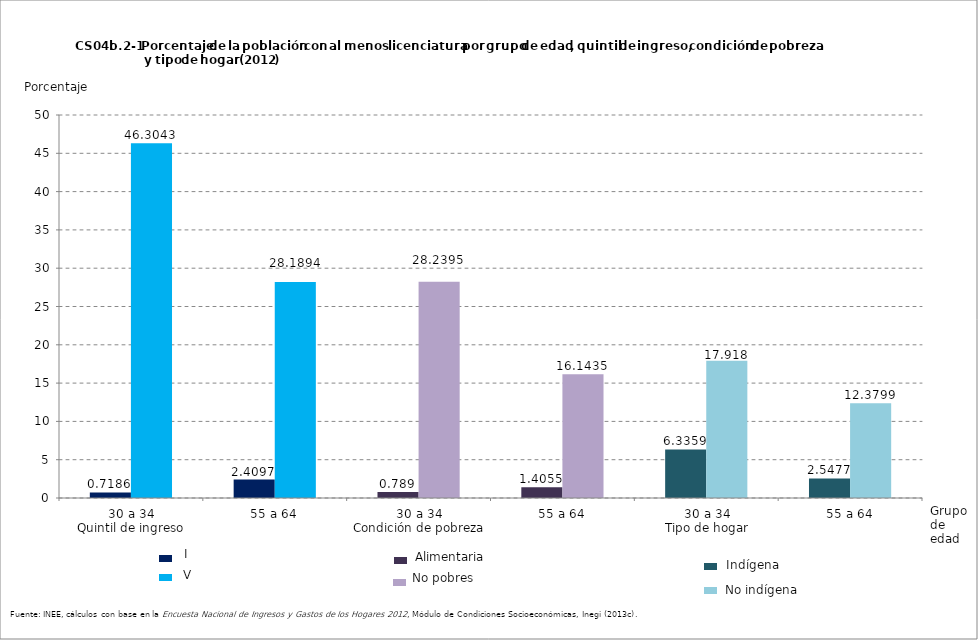
| Category | Series 0 | Series 1 |
|---|---|---|
| 0 | 0.719 | 46.304 |
| 1 | 2.41 | 28.189 |
| 2 | 0.789 | 28.24 |
| 3 | 1.406 | 16.144 |
| 4 | 6.336 | 17.918 |
| 5 | 2.548 | 12.38 |